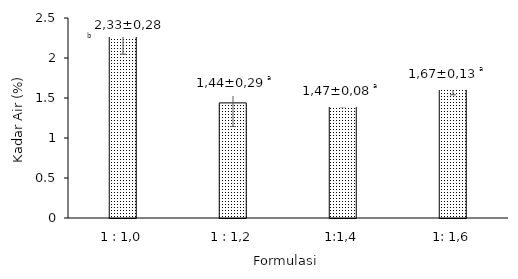
| Category | Kadar Air (%) |
|---|---|
| 1 : 1,0 | 2.326 |
| 1 : 1,2 | 1.439 |
| 1:1,4 | 1.472 |
| 1: 1,6 | 1.675 |